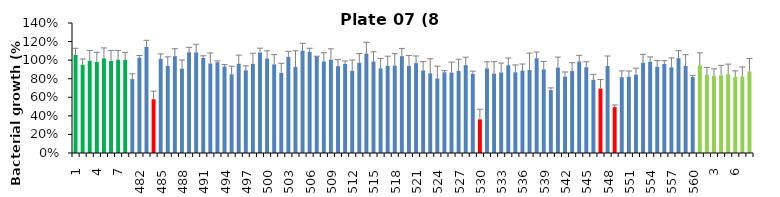
| Category | 8 h % |
|---|---|
| 1.0 | 1.057 |
| 2.0 | 0.951 |
| 3.0 | 0.993 |
| 4.0 | 0.981 |
| 5.0 | 1.02 |
| 6.0 | 0.991 |
| 7.0 | 1.004 |
| 8.0 | 1.003 |
| 481.0 | 0.796 |
| 482.0 | 1.027 |
| 483.0 | 1.144 |
| 484.0 | 0.579 |
| 485.0 | 1.015 |
| 486.0 | 0.938 |
| 487.0 | 1.043 |
| 488.0 | 0.908 |
| 489.0 | 1.085 |
| 490.0 | 1.083 |
| 491.0 | 1.024 |
| 492.0 | 0.964 |
| 493.0 | 0.977 |
| 494.0 | 0.932 |
| 495.0 | 0.847 |
| 496.0 | 0.961 |
| 497.0 | 0.89 |
| 498.0 | 0.959 |
| 499.0 | 1.081 |
| 500.0 | 1.016 |
| 501.0 | 0.954 |
| 502.0 | 0.863 |
| 503.0 | 1.035 |
| 504.0 | 0.928 |
| 505.0 | 1.103 |
| 506.0 | 1.089 |
| 507.0 | 1.038 |
| 508.0 | 0.985 |
| 509.0 | 1.006 |
| 510.0 | 0.935 |
| 511.0 | 0.959 |
| 512.0 | 0.885 |
| 513.0 | 0.973 |
| 514.0 | 1.072 |
| 515.0 | 0.986 |
| 516.0 | 0.912 |
| 517.0 | 0.939 |
| 518.0 | 0.941 |
| 519.0 | 1.043 |
| 520.0 | 0.938 |
| 521.0 | 0.968 |
| 522.0 | 0.889 |
| 523.0 | 0.858 |
| 524.0 | 0.803 |
| 525.0 | 0.869 |
| 526.0 | 0.866 |
| 527.0 | 0.884 |
| 528.0 | 0.946 |
| 529.0 | 0.854 |
| 530.0 | 0.363 |
| 531.0 | 0.911 |
| 532.0 | 0.855 |
| 533.0 | 0.867 |
| 534.0 | 0.945 |
| 535.0 | 0.869 |
| 536.0 | 0.888 |
| 537.0 | 0.894 |
| 538.0 | 1.021 |
| 539.0 | 0.901 |
| 540.0 | 0.677 |
| 541.0 | 0.921 |
| 542.0 | 0.823 |
| 543.0 | 0.883 |
| 544.0 | 0.986 |
| 545.0 | 0.923 |
| 546.0 | 0.789 |
| 547.0 | 0.694 |
| 548.0 | 0.936 |
| 549.0 | 0.494 |
| 550.0 | 0.817 |
| 551.0 | 0.821 |
| 552.0 | 0.844 |
| 553.0 | 0.972 |
| 554.0 | 0.982 |
| 555.0 | 0.928 |
| 556.0 | 0.959 |
| 557.0 | 0.922 |
| 558.0 | 1.022 |
| 559.0 | 0.937 |
| 560.0 | 0.818 |
| 1.0 | 0.944 |
| 2.0 | 0.844 |
| 3.0 | 0.83 |
| 4.0 | 0.838 |
| 5.0 | 0.848 |
| 6.0 | 0.822 |
| 7.0 | 0.824 |
| 8.0 | 0.877 |